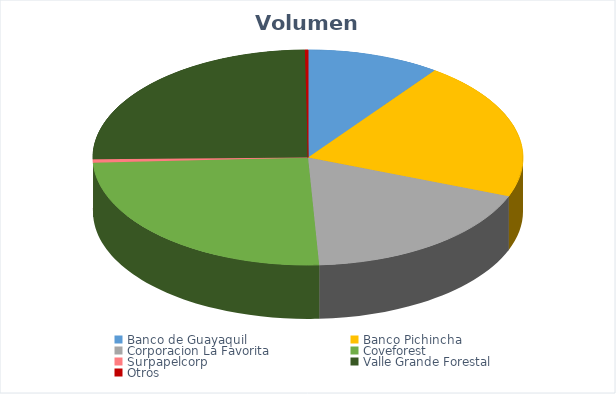
| Category | VOLUMEN ($USD) |
|---|---|
| Banco de Guayaquil | 4800 |
| Banco Pichincha | 10000 |
| Corporacion La Favorita | 8776.52 |
| Coveforest | 12001.6 |
| Surpapelcorp | 255 |
| Valle Grande Forestal | 12001.6 |
| Otros | 111 |